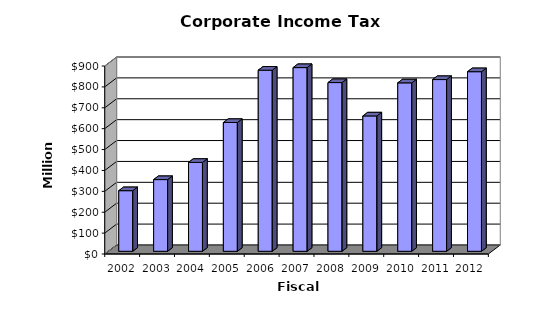
| Category | Amount |
|---|---|
| 2002.0 | 290215035 |
| 2003.0 | 343318607 |
| 2004.0 | 425715754 |
| 2005.0 | 616690263 |
| 2006.0 | 867115786 |
| 2007.0 | 879575371 |
| 2008.0 | 807851584 |
| 2009.0 | 648032537 |
| 2010.0 | 806472760 |
| 2011.0 | 822258802.84 |
| 2012.0 | 859922839.55 |